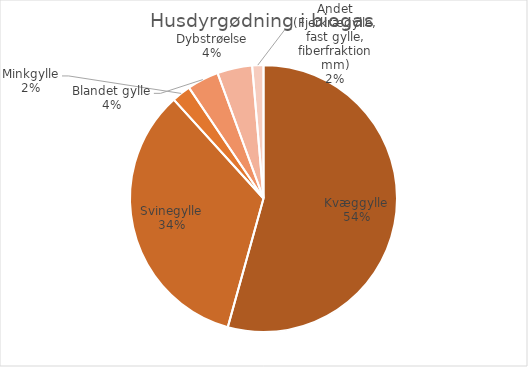
| Category | Series 0 |
|---|---|
| Kvæggylle | 2893197.61 |
| Svinegylle | 1808947.05 |
| Minkgylle | 123225.04 |
| Blandet gylle | 204094.77 |
| Dybstrøelse | 225424.36 |
| Andet (Fjerkrægylle, fast gylle, fiberfraktion mm) | 72435.48 |